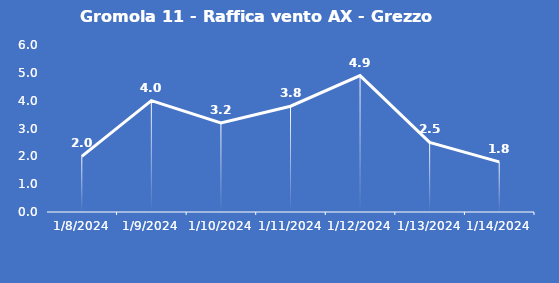
| Category | Gromola 11 - Raffica vento AX - Grezzo (m/s) |
|---|---|
| 1/8/24 | 2 |
| 1/9/24 | 4 |
| 1/10/24 | 3.2 |
| 1/11/24 | 3.8 |
| 1/12/24 | 4.9 |
| 1/13/24 | 2.5 |
| 1/14/24 | 1.8 |